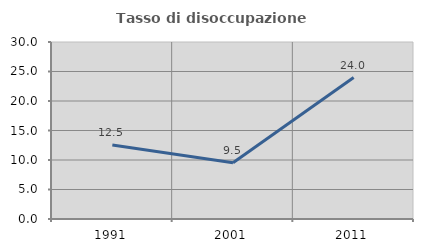
| Category | Tasso di disoccupazione giovanile  |
|---|---|
| 1991.0 | 12.548 |
| 2001.0 | 9.524 |
| 2011.0 | 23.973 |